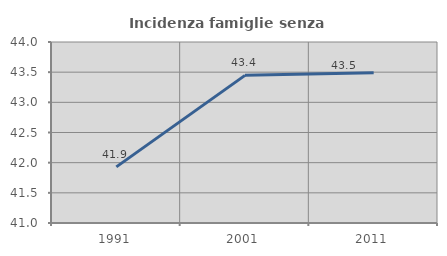
| Category | Incidenza famiglie senza nuclei |
|---|---|
| 1991.0 | 41.93 |
| 2001.0 | 43.447 |
| 2011.0 | 43.492 |